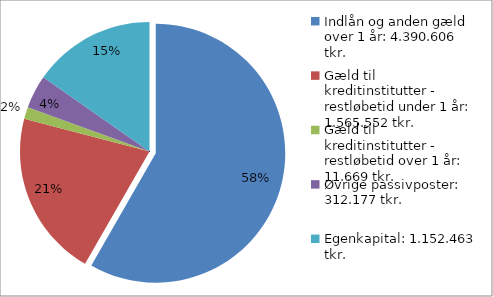
| Category | Series 0 |
|---|---|
| Indlån og anden gæld over 1 år: 4.390.606 tkr.  | 4390606 |
| Gæld til kreditinstitutter - restløbetid under 1 år: 1.565.552 tkr. | 1565551 |
| Gæld til kreditinstitutter - restløbetid over 1 år: 11.669 tkr. | 111669 |
| Øvrige passivposter: 312.177 tkr. | 312177 |
| Egenkapital: 1.152.463 tkr. | 1152463 |